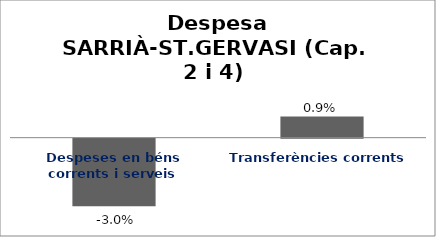
| Category | Series 0 |
|---|---|
| Despeses en béns corrents i serveis | -0.03 |
| Transferències corrents | 0.009 |